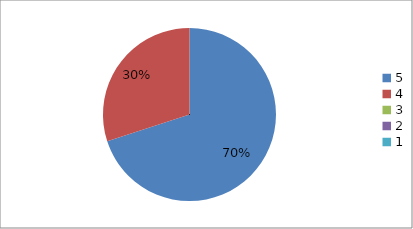
| Category | Series 0 | Series 1 |
|---|---|---|
| 5.0 | 70 | 70 |
| 4.0 | 30 | 30 |
| 3.0 | 0 | 0 |
| 2.0 | 0 | 0 |
| 1.0 | 0 | 0 |